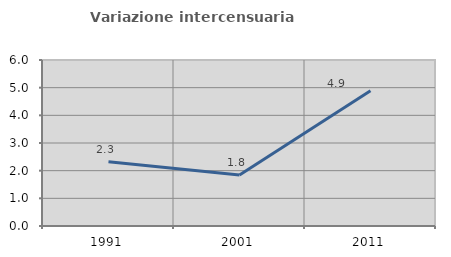
| Category | Variazione intercensuaria annua |
|---|---|
| 1991.0 | 2.32 |
| 2001.0 | 1.844 |
| 2011.0 | 4.892 |